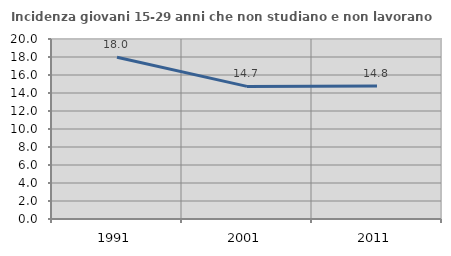
| Category | Incidenza giovani 15-29 anni che non studiano e non lavorano  |
|---|---|
| 1991.0 | 17.981 |
| 2001.0 | 14.736 |
| 2011.0 | 14.79 |